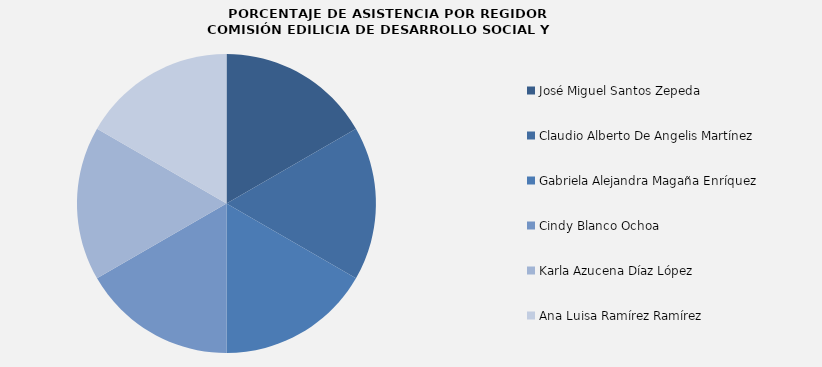
| Category | Series 0 |
|---|---|
| José Miguel Santos Zepeda  | 100 |
| Claudio Alberto De Angelis Martínez | 100 |
| Gabriela Alejandra Magaña Enríquez | 100 |
| Cindy Blanco Ochoa | 100 |
| Karla Azucena Díaz López | 100 |
| Ana Luisa Ramírez Ramírez | 100 |